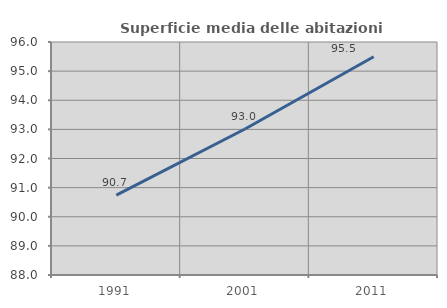
| Category | Superficie media delle abitazioni occupate |
|---|---|
| 1991.0 | 90.744 |
| 2001.0 | 93.014 |
| 2011.0 | 95.493 |